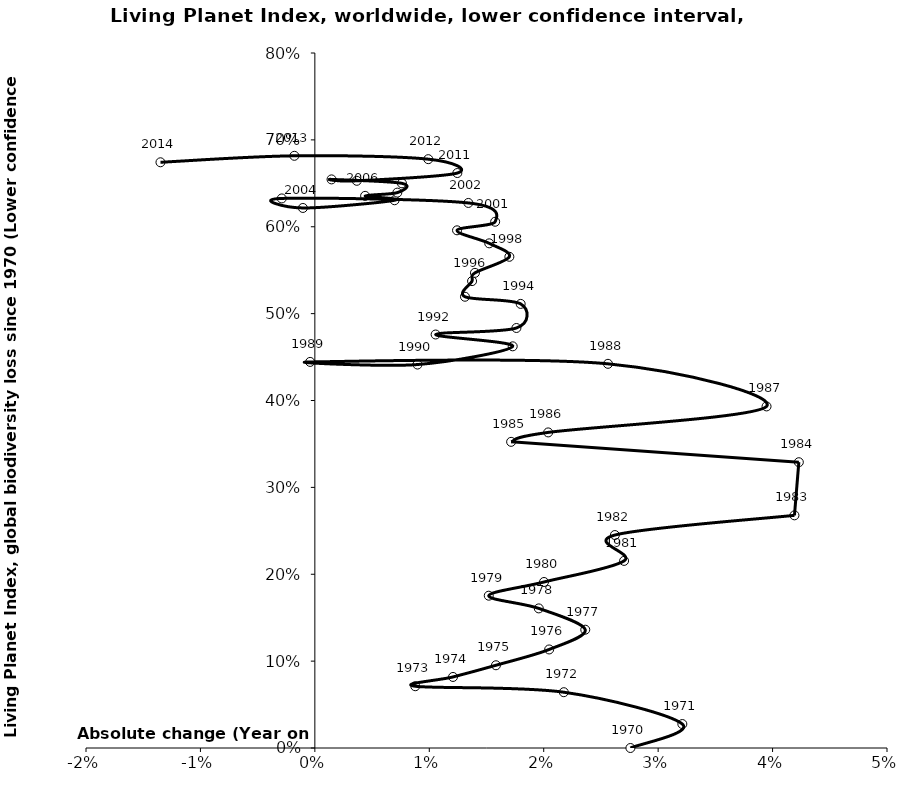
| Category | Series 0 |
|---|---|
| 0.027577576520757985 | 0 |
| 0.03211455008546099 | 0.028 |
| 0.02175624719964453 | 0.064 |
| 0.008774157817352524 | 0.071 |
| 0.01207204631410147 | 0.082 |
| 0.015826419692685 | 0.095 |
| 0.020475341808074532 | 0.113 |
| 0.023631359062502966 | 0.136 |
| 0.019569374749307977 | 0.161 |
| 0.015197065309364044 | 0.175 |
| 0.020026546418832003 | 0.191 |
| 0.027023128025802978 | 0.215 |
| 0.026219722760489006 | 0.245 |
| 0.041912985818732484 | 0.268 |
| 0.042295526120967486 | 0.329 |
| 0.017152446184198034 | 0.352 |
| 0.020390726881811982 | 0.363 |
| 0.039474186776016995 | 0.393 |
| 0.025615288221007004 | 0.442 |
| -0.00041192345906954086 | 0.444 |
| 0.008968607469391543 | 0.441 |
| 0.01728996514027753 | 0.462 |
| 0.010553775470087456 | 0.476 |
| 0.017615355258004006 | 0.483 |
| 0.01798597420158954 | 0.511 |
| 0.013117885381371486 | 0.519 |
| 0.01373916922179097 | 0.537 |
| 0.01399093785810901 | 0.547 |
| 0.01699786805637249 | 0.565 |
| 0.015236538265948951 | 0.581 |
| 0.01242595070809005 | 0.596 |
| 0.01575675997301551 | 0.606 |
| 0.013415194340514969 | 0.627 |
| -0.0028889999763709318 | 0.633 |
| -0.001045231773626032 | 0.622 |
| 0.006967160683722495 | 0.631 |
| 0.004391587082775539 | 0.636 |
| 0.007206340956204427 | 0.639 |
| 0.007611448150282474 | 0.65 |
| 0.0014571860679720716 | 0.655 |
| 0.003664127847796017 | 0.653 |
| 0.012452826615983459 | 0.662 |
| 0.009911895932198989 | 0.678 |
| -0.0017904348661449965 | 0.682 |
| -0.013492765664488982 | 0.674 |